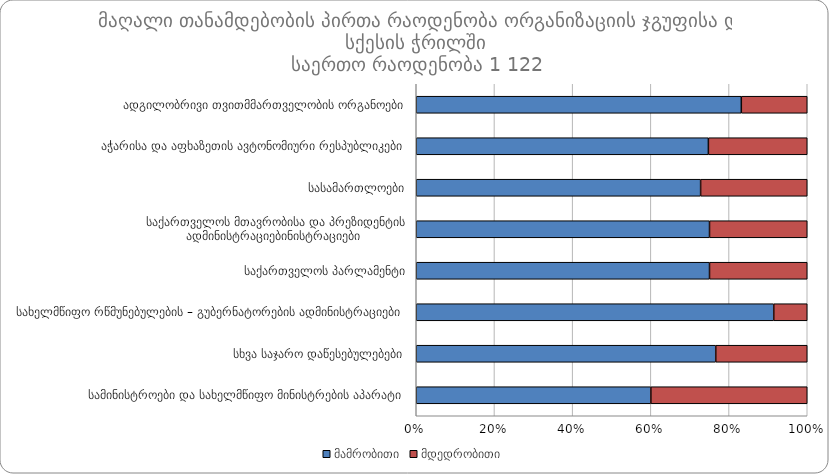
| Category |  მამრობითი	 |  მდედრობითი |
|---|---|---|
|  ადგილობრივი თვითმმართველობის ორგანოები | 641 | 130 |
|  აჭარისა და აფხაზეთის ავტონომიური რესპუბლიკები | 65 | 22 |
|  სასამართლოები | 8 | 3 |
|  საქართველოს მთავრობისა და პრეზიდენტის ადმინისტრაციებინისტრაციები | 6 | 2 |
|  საქართველოს პარლამენტი | 3 | 1 |
|  სახელმწიფო რწმუნებულების – გუბერნატორების ადმინისტრაციები | 32 | 3 |
|  სხვა საჯარო დაწესებულებები | 36 | 11 |
|  სამინისტროები და სახელმწიფო მინისტრების აპარატი | 99 | 66 |